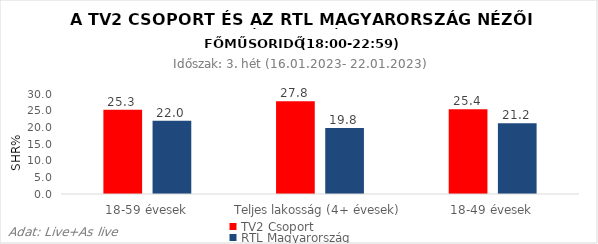
| Category | TV2 Csoport | RTL Magyarország |
|---|---|---|
| 18-59 évesek | 25.3 | 22 |
| Teljes lakosság (4+ évesek) | 27.8 | 19.8 |
| 18-49 évesek | 25.4 | 21.2 |